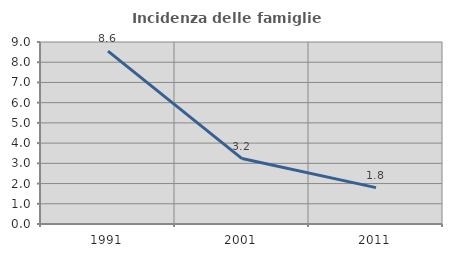
| Category | Incidenza delle famiglie numerose |
|---|---|
| 1991.0 | 8.552 |
| 2001.0 | 3.237 |
| 2011.0 | 1.8 |